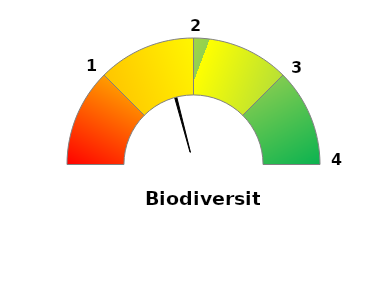
| Category | Variable | Fixe |
|---|---|---|
| 0.0 | 0.413 | 0 |
| 1.0 | 0.01 | 25 |
| 2.0 | 0.577 | 25 |
| 3.0 | 0 | 25 |
| 4.0 | 0 | 25 |
| 5.0 | 1 | 100 |